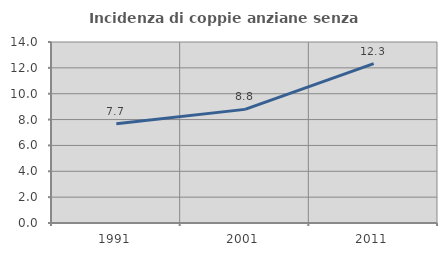
| Category | Incidenza di coppie anziane senza figli  |
|---|---|
| 1991.0 | 7.677 |
| 2001.0 | 8.789 |
| 2011.0 | 12.329 |